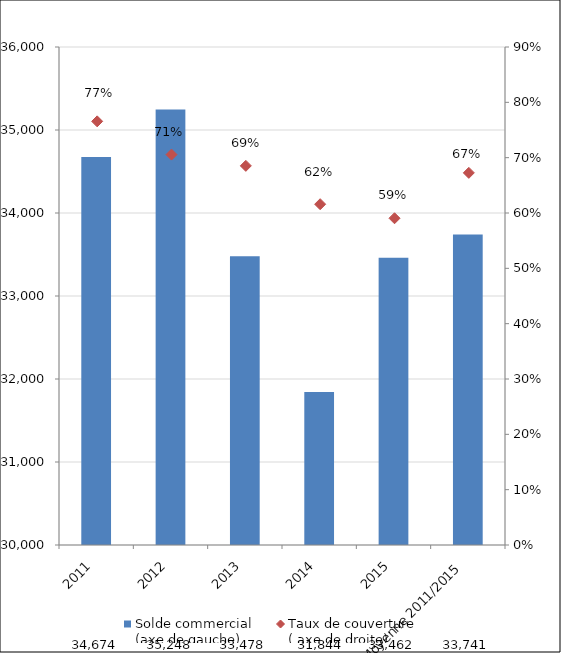
| Category | Solde commercial 
(axe de gauche) |
|---|---|
| 2011 | 34673.736 |
| 2012 | 35248.128 |
| 2013 | 33478.18 |
| 2014 | 31843.595 |
| 2015 | 33462.188 |
| Moyenne 2011/2015 | 33741.165 |